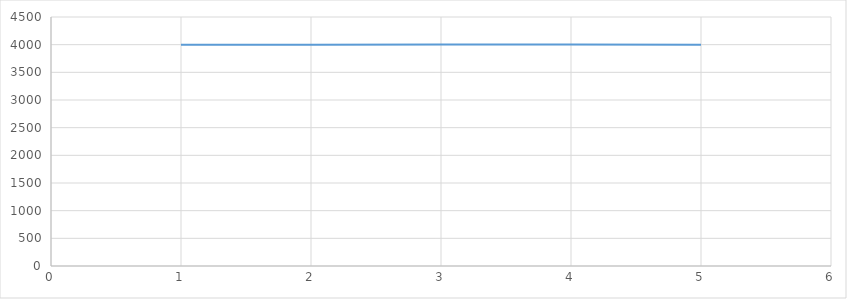
| Category | Series 0 |
|---|---|
| nan | 1 |
| 1.0 | 4000 |
| 2.0 | 4000 |
| 3.0 | 4001 |
| 4.0 | 4005 |
| 5.0 | 4000 |
| nan | 6000 |